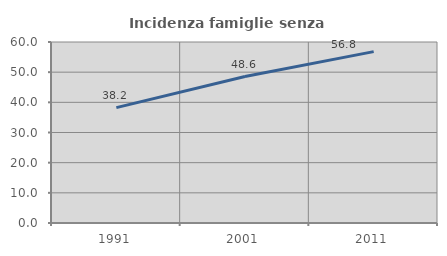
| Category | Incidenza famiglie senza nuclei |
|---|---|
| 1991.0 | 38.242 |
| 2001.0 | 48.554 |
| 2011.0 | 56.801 |